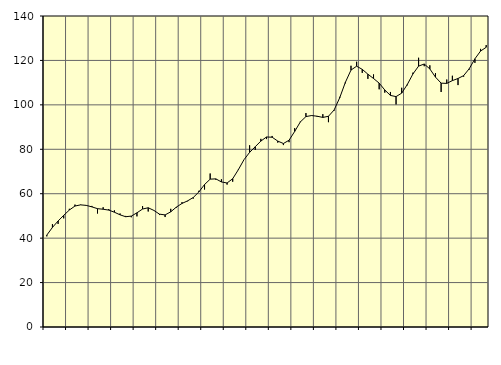
| Category | Piggar | Series 1 |
|---|---|---|
| nan | 40.8 | 41.38 |
| 1.0 | 46.3 | 44.83 |
| 1.0 | 46.4 | 47.72 |
| 1.0 | 48.9 | 50.26 |
| nan | 53.2 | 52.66 |
| 2.0 | 55.1 | 54.45 |
| 2.0 | 55.1 | 54.98 |
| 2.0 | 54.6 | 54.75 |
| nan | 54.5 | 54.08 |
| 3.0 | 51.1 | 53.27 |
| 3.0 | 53.9 | 53.01 |
| 3.0 | 53.1 | 52.62 |
| nan | 52.5 | 51.67 |
| 4.0 | 51.1 | 50.5 |
| 4.0 | 50 | 49.64 |
| 4.0 | 49.4 | 49.92 |
| nan | 49.8 | 51.4 |
| 5.0 | 54.4 | 53.1 |
| 5.0 | 52 | 53.68 |
| 5.0 | 52.4 | 52.49 |
| nan | 50.4 | 50.8 |
| 6.0 | 49.5 | 50.46 |
| 6.0 | 53.2 | 51.84 |
| 6.0 | 53.7 | 53.98 |
| nan | 56.2 | 55.62 |
| 7.0 | 56.6 | 56.79 |
| 7.0 | 57.8 | 58.3 |
| 7.0 | 61.3 | 60.81 |
| nan | 61.9 | 64.13 |
| 8.0 | 69.1 | 66.55 |
| 8.0 | 66.3 | 66.69 |
| 8.0 | 66.5 | 65.3 |
| nan | 64.1 | 64.83 |
| 9.0 | 65.4 | 66.75 |
| 9.0 | 71 | 70.8 |
| 9.0 | 75.3 | 75.3 |
| nan | 81.8 | 78.6 |
| 10.0 | 79.7 | 81.15 |
| 10.0 | 84.7 | 83.69 |
| 10.0 | 84.6 | 85.54 |
| nan | 86 | 85.43 |
| 11.0 | 83 | 83.69 |
| 11.0 | 81.9 | 82.6 |
| 11.0 | 83.2 | 84.07 |
| nan | 89.5 | 88.01 |
| 12.0 | 92.5 | 92.3 |
| 12.0 | 96.3 | 94.72 |
| 12.0 | 95.3 | 95.19 |
| nan | 94.6 | 94.88 |
| 13.0 | 95.8 | 94.34 |
| 13.0 | 92.2 | 94.86 |
| 13.0 | 97.4 | 97.69 |
| nan | 103.6 | 103.2 |
| 14.0 | 109.7 | 110.14 |
| 14.0 | 117.6 | 115.66 |
| 14.0 | 119.4 | 117.4 |
| nan | 114.4 | 115.98 |
| 15.0 | 111.7 | 113.8 |
| 15.0 | 113.7 | 111.87 |
| 15.0 | 107 | 109.78 |
| nan | 105.5 | 106.7 |
| 16.0 | 105.8 | 104.25 |
| 16.0 | 100.2 | 103.71 |
| 16.0 | 107.7 | 105.27 |
| nan | 108.8 | 109.18 |
| 17.0 | 114.5 | 113.92 |
| 17.0 | 121.2 | 117.44 |
| 17.0 | 117.4 | 118.39 |
| nan | 117.8 | 116.17 |
| 18.0 | 114.3 | 112.48 |
| 18.0 | 105.8 | 109.77 |
| 18.0 | 111.4 | 109.65 |
| nan | 113.1 | 110.92 |
| 19.0 | 108.9 | 111.87 |
| 19.0 | 112.7 | 113.16 |
| 19.0 | 115.9 | 116.3 |
| nan | 118.9 | 120.73 |
| 20.0 | 125.2 | 124.22 |
| 20.0 | 126.9 | 125.91 |